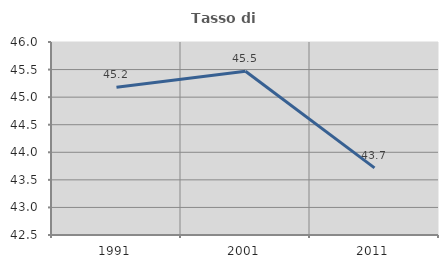
| Category | Tasso di occupazione   |
|---|---|
| 1991.0 | 45.178 |
| 2001.0 | 45.469 |
| 2011.0 | 43.717 |